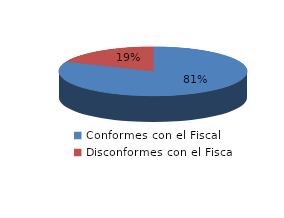
| Category | Series 0 |
|---|---|
| 0 | 22 |
| 1 | 5 |